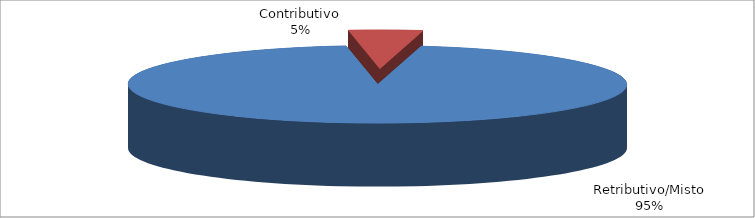
| Category | Series 1 |
|---|---|
| Retributivo/Misto | 78275 |
| Contributivo | 3946 |